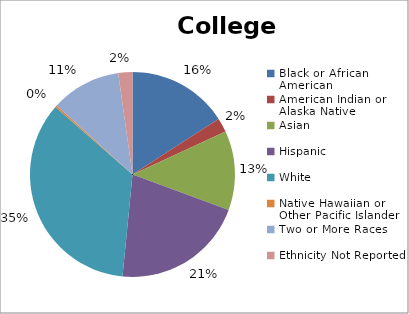
| Category | Black or African American |
|---|---|
| Black or African American | 0.159 |
| American Indian or Alaska Native | 0.022 |
| Asian | 0.125 |
| Hispanic | 0.209 |
| White | 0.349 |
| Native Hawaiian or Other Pacific Islander | 0.003 |
| Two or More Races | 0.11 |
| Ethnicity Not Reported | 0.022 |